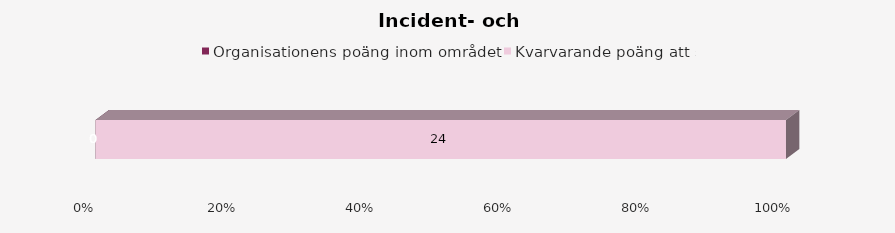
| Category | Organisationens poäng inom området | Kvarvarande poäng att samla |
|---|---|---|
| 0 | 0 | 24 |